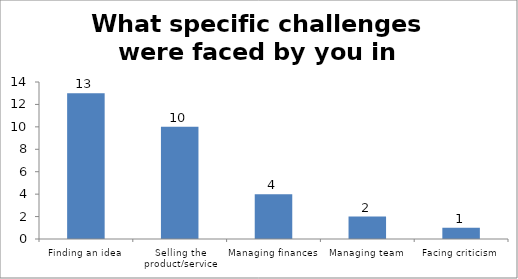
| Category | What specific challenges were faced by you in creating value? |
|---|---|
| Finding an idea | 13 |
| Selling the product/service | 10 |
| Managing finances | 4 |
| Managing team | 2 |
| Facing criticism | 1 |